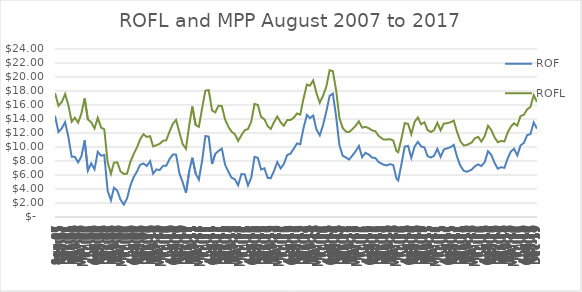
| Category | ROF | ROFL |
|---|---|---|
| 2007-08-30 | 14.47 | 17.686 |
| 2007-09-01 | 14.26 | 17.659 |
| 2007-10-01 | 12.15 | 15.88 |
| 2007-11-01 | 12.67 | 16.424 |
| 2007-12-02 | 13.55 | 17.56 |
| 2008-01-01 | 11.43 | 15.983 |
| 2008-02-01 | 8.6 | 13.615 |
| 2008-03-01 | 8.61 | 14.178 |
| 2008-04-01 | 7.8 | 13.477 |
| 2008-05-01 | 8.64 | 14.758 |
| 2008-06-01 | 10.94 | 16.932 |
| 2008-07-01 | 6.61 | 13.933 |
| 2008-08-01 | 7.66 | 13.536 |
| 2008-09-01 | 6.81 | 12.656 |
| 2008-10-01 | 9.31 | 14.18 |
| 2008-11-01 | 8.76 | 12.77 |
| 2008-12-01 | 8.86 | 12.52 |
| 2009-01-01 | 3.76 | 7.832 |
| 2009-02-01 | 2.38 | 6.17 |
| 2009-03-01 | 4.17 | 7.762 |
| 2009-04-01 | 3.77 | 7.817 |
| 2009-05-01 | 2.48 | 6.515 |
| 2009-06-01 | 1.78 | 6.145 |
| 2009-07-01 | 2.65 | 6.197 |
| 2009-08-01 | 4.49 | 7.885 |
| 2009-09-01 | 5.7 | 9.002 |
| 2009-10-01 | 6.49 | 9.925 |
| 2009-11-01 | 7.46 | 11.12 |
| 2009-12-01 | 7.65 | 11.828 |
| 2010-01-01 | 7.29 | 11.439 |
| 2010-02-01 | 7.98 | 11.542 |
| 2010-03-01 | 6.19 | 10.08 |
| 2010-04-01 | 6.81 | 10.262 |
| 2010-05-01 | 6.7 | 10.449 |
| 2010-06-01 | 7.3 | 10.885 |
| 2010-07-01 | 7.32 | 10.951 |
| 2010-08-01 | 8.27 | 12.201 |
| 2010-09-01 | 8.93 | 13.319 |
| 2010-10-01 | 8.91 | 13.871 |
| 2010-11-01 | 6.24 | 12.063 |
| 2010-12-01 | 4.98 | 10.423 |
| 2011-01-01 | 3.45 | 9.741 |
| 2011-02-01 | 6.6 | 13.197 |
| 2011-03-01 | 8.47 | 15.781 |
| 2011-04-01 | 6.23 | 13.163 |
| 2011-05-01 | 5.32 | 12.884 |
| 2011-06-01 | 8.08 | 15.557 |
| 2011-07-01 | 11.57 | 18.045 |
| 2011-08-01 | 11.48 | 18.138 |
| 2011-09-01 | 7.57 | 15.243 |
| 2011-10-01 | 9.02 | 14.944 |
| 2011-11-01 | 9.44 | 15.909 |
| 2011-12-01 | 9.77 | 15.848 |
| 2012-01-01 | 7.45 | 13.919 |
| 2012-02-01 | 6.48 | 12.867 |
| 2012-03-01 | 5.61 | 12.191 |
| 2012-04-01 | 5.39 | 11.833 |
| 2012-05-01 | 4.53 | 10.875 |
| 2012-06-01 | 6.13 | 11.685 |
| 2012-07-01 | 6.1 | 12.385 |
| 2012-08-01 | 4.51 | 12.573 |
| 2012-09-01 | 5.64 | 13.638 |
| 2012-10-01 | 8.59 | 16.151 |
| 2012-11-01 | 8.45 | 16.008 |
| 2012-12-01 | 6.78 | 14.311 |
| 2013-01-01 | 6.96 | 13.946 |
| 2013-02-01 | 5.58 | 12.986 |
| 2013-03-01 | 5.54 | 12.574 |
| 2013-04-01 | 6.59 | 13.544 |
| 2013-05-01 | 7.86 | 14.355 |
| 2013-06-01 | 6.93 | 13.548 |
| 2013-07-01 | 7.56 | 13.031 |
| 2013-08-01 | 8.85 | 13.84 |
| 2013-09-01 | 9.04 | 13.856 |
| 2013-10-01 | 9.75 | 14.166 |
| 2013-11-01 | 10.51 | 14.794 |
| 2013-12-01 | 10.38 | 14.624 |
| 2014-01-01 | 12.73 | 16.95 |
| 2014-02-01 | 14.58 | 18.919 |
| 2014-03-01 | 14.12 | 18.753 |
| 2014-04-01 | 14.5 | 19.517 |
| 2014-05-01 | 12.49 | 17.683 |
| 2014-06-01 | 11.67 | 16.328 |
| 2014-07-01 | 13.11 | 17.293 |
| 2014-08-01 | 15.06 | 18.63 |
| 2014-09-01 | 17.32 | 20.969 |
| 2014-10-01 | 17.62 | 20.831 |
| 2014-11-01 | 14.28 | 18.05 |
| 2014-12-01 | 10.27 | 14.157 |
| 2015-01-01 | 8.73 | 12.704 |
| 2015-02-01 | 8.49 | 12.191 |
| 2015-03-01 | 8.2 | 12.136 |
| 2015-04-01 | 8.78 | 12.542 |
| 2015-05-01 | 9.38 | 13.029 |
| 2015-06-01 | 10.15 | 13.663 |
| 2015-07-01 | 8.54 | 12.761 |
| 2015-08-01 | 9.17 | 12.883 |
| 2015-09-01 | 8.93 | 12.684 |
| 2015-10-01 | 8.49 | 12.37 |
| 2015-11-01 | 8.43 | 12.256 |
| 2015-12-01 | 7.86 | 11.587 |
| 2016-01-16 | 7.48 | 11.065 |
| 2016-02-16 | 7.36 | 11.076 |
| 2016-03-16 | 7.55 | 11.115 |
| 2016-04-16 | 7.41 | 10.927 |
| 2016-05-16 | 5.49 | 9.412 |
| 2016-06-01 | 5.206 | 9.254 |
| 2016-07-01 | 7.527 | 11.182 |
| 2016-08-01 | 10.066 | 13.411 |
| 2016-09-01 | 10.151 | 13.306 |
| 2016-10-01 | 8.456 | 11.824 |
| 2016-11-01 | 10.052 | 13.599 |
| 2016-12-01 | 10.732 | 14.217 |
| 2017-01-01 | 10.084 | 13.25 |
| 2017-02-01 | 9.936 | 13.534 |
| 2017-03-01 | 8.708 | 12.446 |
| 2017-04-01 | 8.494 | 12.136 |
| 2017-05-01 | 8.747 | 12.412 |
| 2017-06-01 | 9.739 | 13.459 |
| 2017-07-01 | 8.578 | 12.388 |
| 2017-08-01 | 9.66 | 13.36 |
| 2017-09-01 | 9.817 | 13.395 |
| 2017-10-01 | 9.98 | 13.532 |
| 2017-11-01 | 10.304 | 13.762 |
| 2017-12-01 | 8.618 | 12.175 |
| 2018-01-01 | 7.324 | 10.832 |
| 2018-02-01 | 6.617 | 10.232 |
| 2018-03-01 | 6.453 | 10.273 |
| 2018-04-16 | 6.75 | 10.63 |
| 2018-05-16 | 7.23 | 11.24 |
| 2018-06-16 | 7.52 | 11.46 |
| 2018-07-16 | 7.27 | 10.77 |
| 2018-08-16 | 7.83 | 11.55 |
| 2018-09-16 | 9.39 | 13.04 |
| 2018-10-16 | 8.88 | 12.44 |
| 2018-11-16 | 7.74 | 11.38 |
| 2018-12-16 | 6.9 | 10.68 |
| 2019-01-16 | 7.11 | 10.86 |
| 2019-02-16 | 7.03 | 10.79 |
| 2019-03-16 | 8.27 | 11.98 |
| 2019-04-16 | 9.33 | 12.9 |
| 2019-05-16 | 9.75 | 13.38 |
| 2019-06-16 | 8.79 | 13.06 |
| 2019-07-16 | 10.22 | 14.42 |
| 2019-08-16 | 10.59 | 14.6 |
| 2019-09-16 | 11.7 | 15.39 |
| 2019-10-16 | 11.83 | 15.71 |
| 2019-11-16 | 13.51 | 17.41 |
| 2019-12-16 | 12.63 | 16.44 |